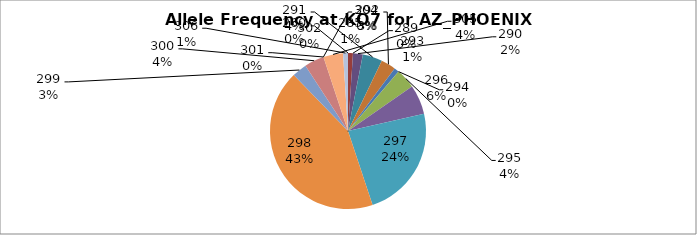
| Category | Series 0 |
|---|---|
| 260.0 | 0 |
| 285.0 | 0.01 |
| 289.0 | 0 |
| 290.0 | 0.02 |
| 291.0 | 0.041 |
| 292.0 | 0.031 |
| 293.0 | 0.01 |
| 294.0 | 0 |
| 295.0 | 0.041 |
| 296.0 | 0.061 |
| 297.0 | 0.235 |
| 298.0 | 0.429 |
| 299.0 | 0.031 |
| 300.0 | 0.041 |
| 301.0 | 0 |
| 302.0 | 0 |
| 304.0 | 0 |
| 305.0 | 0.041 |
| 306.0 | 0.01 |